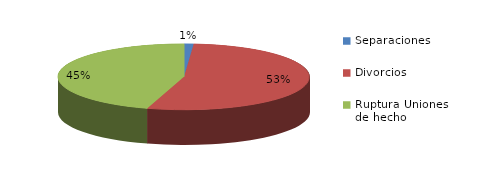
| Category | Series 0 |
|---|---|
| Separaciones | 23 |
| Divorcios | 1002 |
| Ruptura Uniones de hecho | 849 |